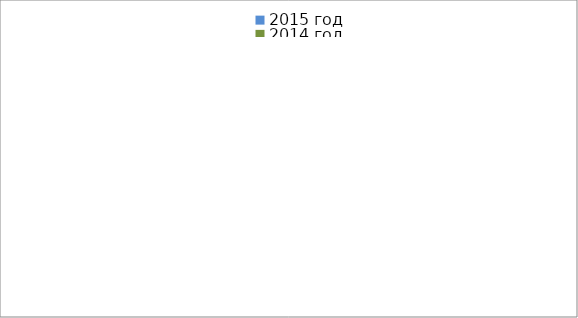
| Category | 2015 год | 2014 год |
|---|---|---|
|  - поджог | 16 | 16 |
|  - неосторожное обращение с огнём | 43 | 24 |
|  - НПТЭ электрооборудования | 8 | 15 |
|  - НПУ и Э печей | 39 | 45 |
|  - НПУ и Э транспортных средств | 38 | 44 |
|   -Шалость с огнем детей | 3 | 0 |
|  -НППБ при эксплуатации эл.приборов | 11 | 16 |
|  - курение | 17 | 17 |
| - прочие | 67 | 77 |
| - не установленные причины | 6 | 7 |